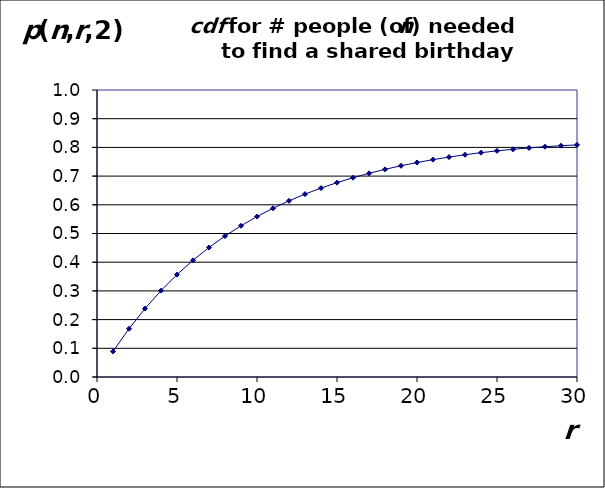
| Category | p(n,r,2) |
|---|---|
| 1.0 | 0.089 |
| 2.0 | 0.168 |
| 3.0 | 0.238 |
| 4.0 | 0.301 |
| 5.0 | 0.357 |
| 6.0 | 0.407 |
| 7.0 | 0.451 |
| 8.0 | 0.491 |
| 9.0 | 0.527 |
| 10.0 | 0.559 |
| 11.0 | 0.588 |
| 12.0 | 0.614 |
| 13.0 | 0.637 |
| 14.0 | 0.658 |
| 15.0 | 0.677 |
| 16.0 | 0.694 |
| 17.0 | 0.71 |
| 18.0 | 0.724 |
| 19.0 | 0.736 |
| 20.0 | 0.747 |
| 21.0 | 0.757 |
| 22.0 | 0.766 |
| 23.0 | 0.774 |
| 24.0 | 0.782 |
| 25.0 | 0.788 |
| 26.0 | 0.793 |
| 27.0 | 0.798 |
| 28.0 | 0.802 |
| 29.0 | 0.806 |
| 30.0 | 0.809 |